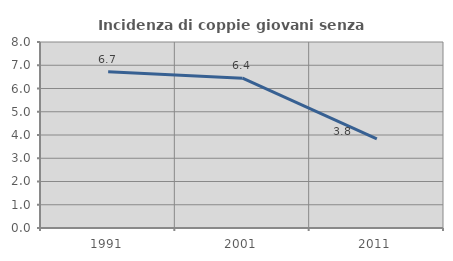
| Category | Incidenza di coppie giovani senza figli |
|---|---|
| 1991.0 | 6.716 |
| 2001.0 | 6.444 |
| 2011.0 | 3.838 |